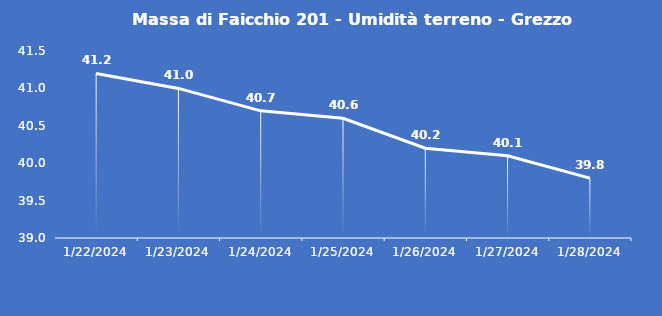
| Category | Massa di Faicchio 201 - Umidità terreno - Grezzo (%VWC) |
|---|---|
| 1/22/24 | 41.2 |
| 1/23/24 | 41 |
| 1/24/24 | 40.7 |
| 1/25/24 | 40.6 |
| 1/26/24 | 40.2 |
| 1/27/24 | 40.1 |
| 1/28/24 | 39.8 |